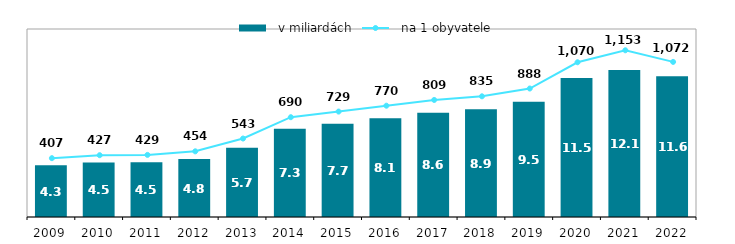
| Category |   v miliardách |
|---|---|
| 2009.0 | 4.274 |
| 2010.0 | 4.501 |
| 2011.0 | 4.512 |
| 2012.0 | 4.775 |
| 2013.0 | 5.705 |
| 2014.0 | 7.273 |
| 2015.0 | 7.694 |
| 2016.0 | 8.141 |
| 2017.0 | 8.587 |
| 2018.0 | 8.888 |
| 2019.0 | 9.501 |
| 2020.0 | 11.451 |
| 2021.0 | 12.125 |
| 2022.0 | 11.613 |